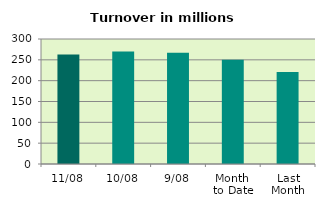
| Category | Series 0 |
|---|---|
| 11/08 | 262.93 |
| 10/08 | 270.09 |
| 9/08 | 266.852 |
| Month 
to Date | 250.47 |
| Last
Month | 220.762 |